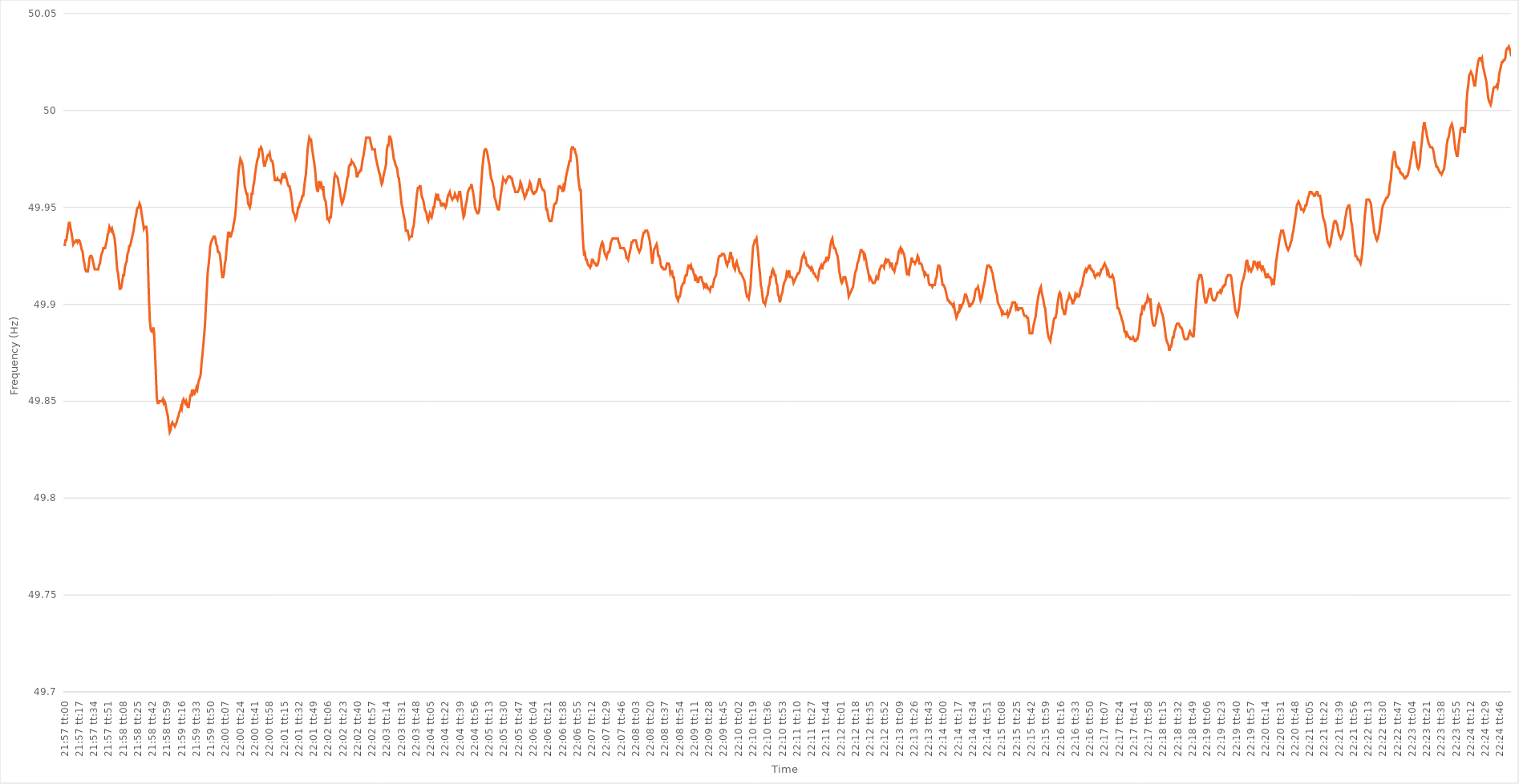
| Category | Series 0 |
|---|---|
| 0.9145833333333333 | 49.93 |
| 0.9145949074074075 | 49.933 |
| 0.9146064814814815 | 49.933 |
| 0.9146180555555555 | 49.936 |
| 0.9146296296296296 | 49.939 |
| 0.9146412037037037 | 49.942 |
| 0.9146527777777779 | 49.942 |
| 0.9146643518518518 | 49.939 |
| 0.914675925925926 | 49.937 |
| 0.9146875 | 49.934 |
| 0.9146990740740741 | 49.931 |
| 0.9147106481481481 | 49.932 |
| 0.9147222222222222 | 49.932 |
| 0.9147337962962964 | 49.933 |
| 0.9147453703703704 | 49.933 |
| 0.9147569444444444 | 49.932 |
| 0.9147685185185185 | 49.933 |
| 0.9147800925925926 | 49.933 |
| 0.9147916666666666 | 49.932 |
| 0.9148032407407407 | 49.93 |
| 0.9148148148148149 | 49.928 |
| 0.9148263888888889 | 49.927 |
| 0.9148379629629629 | 49.923 |
| 0.914849537037037 | 49.921 |
| 0.9148611111111111 | 49.918 |
| 0.9148726851851853 | 49.917 |
| 0.9148842592592592 | 49.917 |
| 0.9148958333333334 | 49.917 |
| 0.9149074074074074 | 49.92 |
| 0.9149189814814815 | 49.924 |
| 0.9149305555555555 | 49.925 |
| 0.9149421296296296 | 49.925 |
| 0.9149537037037038 | 49.924 |
| 0.9149652777777778 | 49.922 |
| 0.9149768518518518 | 49.92 |
| 0.9149884259259259 | 49.918 |
| 0.915 | 49.918 |
| 0.915011574074074 | 49.918 |
| 0.9150231481481481 | 49.918 |
| 0.9150347222222223 | 49.918 |
| 0.9150462962962963 | 49.92 |
| 0.9150578703703703 | 49.921 |
| 0.9150694444444444 | 49.924 |
| 0.9150810185185185 | 49.926 |
| 0.9150925925925927 | 49.927 |
| 0.9151041666666666 | 49.929 |
| 0.9151157407407408 | 49.929 |
| 0.9151273148148148 | 49.929 |
| 0.915138888888889 | 49.931 |
| 0.9151504629629629 | 49.933 |
| 0.915162037037037 | 49.936 |
| 0.9151736111111112 | 49.937 |
| 0.9151851851851852 | 49.94 |
| 0.9151967592592593 | 49.939 |
| 0.9152083333333333 | 49.938 |
| 0.9152199074074074 | 49.939 |
| 0.9152314814814814 | 49.937 |
| 0.9152430555555555 | 49.936 |
| 0.9152546296296297 | 49.934 |
| 0.9152662037037037 | 49.93 |
| 0.9152777777777777 | 49.924 |
| 0.9152893518518518 | 49.918 |
| 0.9153009259259259 | 49.916 |
| 0.9153125000000001 | 49.912 |
| 0.915324074074074 | 49.908 |
| 0.9153356481481482 | 49.908 |
| 0.9153472222222222 | 49.909 |
| 0.9153587962962964 | 49.912 |
| 0.9153703703703703 | 49.915 |
| 0.9153819444444444 | 49.915 |
| 0.9153935185185186 | 49.919 |
| 0.9154050925925926 | 49.921 |
| 0.9154166666666667 | 49.922 |
| 0.9154282407407407 | 49.926 |
| 0.9154398148148148 | 49.927 |
| 0.915451388888889 | 49.93 |
| 0.9154629629629629 | 49.93 |
| 0.9154745370370371 | 49.932 |
| 0.9154861111111111 | 49.934 |
| 0.9154976851851853 | 49.936 |
| 0.9155092592592592 | 49.938 |
| 0.9155208333333333 | 49.941 |
| 0.9155324074074075 | 49.944 |
| 0.9155439814814814 | 49.946 |
| 0.9155555555555556 | 49.949 |
| 0.9155671296296296 | 49.95 |
| 0.9155787037037038 | 49.95 |
| 0.9155902777777777 | 49.952 |
| 0.9156018518518518 | 49.951 |
| 0.915613425925926 | 49.948 |
| 0.915625 | 49.945 |
| 0.9156365740740741 | 49.942 |
| 0.9156481481481481 | 49.939 |
| 0.9156597222222222 | 49.94 |
| 0.9156712962962964 | 49.94 |
| 0.9156828703703703 | 49.94 |
| 0.9156944444444445 | 49.935 |
| 0.9157060185185185 | 49.917 |
| 0.9157175925925927 | 49.902 |
| 0.9157291666666666 | 49.891 |
| 0.9157407407407407 | 49.887 |
| 0.9157523148148149 | 49.886 |
| 0.9157638888888888 | 49.886 |
| 0.915775462962963 | 49.888 |
| 0.915787037037037 | 49.884 |
| 0.9157986111111112 | 49.874 |
| 0.9158101851851851 | 49.863 |
| 0.9158217592592592 | 49.852 |
| 0.9158333333333334 | 49.849 |
| 0.9158449074074074 | 49.849 |
| 0.9158564814814815 | 49.85 |
| 0.9158680555555555 | 49.85 |
| 0.9158796296296297 | 49.85 |
| 0.9158912037037038 | 49.85 |
| 0.9159027777777777 | 49.851 |
| 0.9159143518518519 | 49.849 |
| 0.9159259259259259 | 49.85 |
| 0.9159375000000001 | 49.849 |
| 0.915949074074074 | 49.846 |
| 0.9159606481481481 | 49.844 |
| 0.9159722222222223 | 49.842 |
| 0.9159837962962962 | 49.837 |
| 0.9159953703703704 | 49.834 |
| 0.9160069444444444 | 49.835 |
| 0.9160185185185186 | 49.838 |
| 0.9160300925925925 | 49.839 |
| 0.9160416666666666 | 49.838 |
| 0.9160532407407408 | 49.838 |
| 0.9160648148148148 | 49.837 |
| 0.9160763888888889 | 49.838 |
| 0.9160879629629629 | 49.839 |
| 0.9160995370370371 | 49.841 |
| 0.9161111111111112 | 49.842 |
| 0.9161226851851851 | 49.844 |
| 0.9161342592592593 | 49.845 |
| 0.9161458333333333 | 49.847 |
| 0.9161574074074075 | 49.846 |
| 0.9161689814814814 | 49.85 |
| 0.9161805555555556 | 49.851 |
| 0.9161921296296297 | 49.85 |
| 0.9162037037037036 | 49.849 |
| 0.9162152777777778 | 49.85 |
| 0.9162268518518518 | 49.848 |
| 0.916238425925926 | 49.847 |
| 0.9162499999999999 | 49.847 |
| 0.916261574074074 | 49.85 |
| 0.9162731481481482 | 49.853 |
| 0.9162847222222222 | 49.853 |
| 0.9162962962962963 | 49.856 |
| 0.9163078703703703 | 49.854 |
| 0.9163194444444445 | 49.855 |
| 0.9163310185185186 | 49.854 |
| 0.9163425925925925 | 49.855 |
| 0.9163541666666667 | 49.857 |
| 0.9163657407407407 | 49.856 |
| 0.9163773148148149 | 49.859 |
| 0.9163888888888888 | 49.861 |
| 0.916400462962963 | 49.862 |
| 0.9164120370370371 | 49.864 |
| 0.916423611111111 | 49.87 |
| 0.9164351851851852 | 49.874 |
| 0.9164467592592592 | 49.879 |
| 0.9164583333333334 | 49.884 |
| 0.9164699074074073 | 49.89 |
| 0.9164814814814815 | 49.899 |
| 0.9164930555555556 | 49.907 |
| 0.9165046296296296 | 49.916 |
| 0.9165162037037037 | 49.92 |
| 0.9165277777777777 | 49.924 |
| 0.9165393518518519 | 49.93 |
| 0.916550925925926 | 49.932 |
| 0.9165625 | 49.933 |
| 0.9165740740740741 | 49.934 |
| 0.9165856481481481 | 49.935 |
| 0.9165972222222223 | 49.935 |
| 0.9166087962962962 | 49.934 |
| 0.9166203703703704 | 49.931 |
| 0.9166319444444445 | 49.93 |
| 0.9166435185185186 | 49.927 |
| 0.9166550925925926 | 49.927 |
| 0.9166666666666666 | 49.926 |
| 0.9166782407407408 | 49.923 |
| 0.9166898148148147 | 49.918 |
| 0.9167013888888889 | 49.914 |
| 0.916712962962963 | 49.914 |
| 0.916724537037037 | 49.916 |
| 0.9167361111111111 | 49.921 |
| 0.9167476851851851 | 49.923 |
| 0.9167592592592593 | 49.929 |
| 0.9167708333333334 | 49.933 |
| 0.9167824074074074 | 49.937 |
| 0.9167939814814815 | 49.937 |
| 0.9168055555555555 | 49.935 |
| 0.9168171296296297 | 49.935 |
| 0.9168287037037036 | 49.937 |
| 0.9168402777777778 | 49.938 |
| 0.9168518518518519 | 49.941 |
| 0.916863425925926 | 49.943 |
| 0.916875 | 49.946 |
| 0.916886574074074 | 49.951 |
| 0.9168981481481482 | 49.958 |
| 0.9169097222222221 | 49.963 |
| 0.9169212962962963 | 49.969 |
| 0.9169328703703704 | 49.972 |
| 0.9169444444444445 | 49.975 |
| 0.9169560185185185 | 49.974 |
| 0.9169675925925925 | 49.973 |
| 0.9169791666666667 | 49.97 |
| 0.9169907407407408 | 49.966 |
| 0.9170023148148148 | 49.961 |
| 0.9170138888888889 | 49.959 |
| 0.917025462962963 | 49.957 |
| 0.9170370370370371 | 49.957 |
| 0.917048611111111 | 49.952 |
| 0.9170601851851852 | 49.951 |
| 0.9170717592592593 | 49.95 |
| 0.9170833333333334 | 49.952 |
| 0.9170949074074074 | 49.957 |
| 0.9171064814814814 | 49.957 |
| 0.9171180555555556 | 49.961 |
| 0.9171296296296297 | 49.963 |
| 0.9171412037037037 | 49.967 |
| 0.9171527777777778 | 49.97 |
| 0.9171643518518519 | 49.973 |
| 0.9171759259259259 | 49.975 |
| 0.9171874999999999 | 49.976 |
| 0.9171990740740741 | 49.98 |
| 0.9172106481481482 | 49.98 |
| 0.9172222222222222 | 49.981 |
| 0.9172337962962963 | 49.98 |
| 0.9172453703703703 | 49.977 |
| 0.9172569444444445 | 49.973 |
| 0.9172685185185184 | 49.971 |
| 0.9172800925925926 | 49.973 |
| 0.9172916666666667 | 49.974 |
| 0.9173032407407408 | 49.976 |
| 0.9173148148148148 | 49.977 |
| 0.9173263888888888 | 49.977 |
| 0.917337962962963 | 49.978 |
| 0.9173495370370371 | 49.975 |
| 0.9173611111111111 | 49.974 |
| 0.9173726851851852 | 49.974 |
| 0.9173842592592593 | 49.972 |
| 0.9173958333333333 | 49.968 |
| 0.9174074074074073 | 49.964 |
| 0.9174189814814815 | 49.964 |
| 0.9174305555555556 | 49.964 |
| 0.9174421296296296 | 49.965 |
| 0.9174537037037037 | 49.964 |
| 0.9174652777777778 | 49.964 |
| 0.9174768518518519 | 49.964 |
| 0.9174884259259258 | 49.963 |
| 0.9175 | 49.965 |
| 0.9175115740740741 | 49.967 |
| 0.9175231481481482 | 49.967 |
| 0.9175347222222222 | 49.965 |
| 0.9175462962962962 | 49.967 |
| 0.9175578703703704 | 49.966 |
| 0.9175694444444445 | 49.964 |
| 0.9175810185185185 | 49.962 |
| 0.9175925925925926 | 49.961 |
| 0.9176041666666667 | 49.961 |
| 0.9176157407407407 | 49.959 |
| 0.9176273148148147 | 49.956 |
| 0.9176388888888889 | 49.953 |
| 0.917650462962963 | 49.948 |
| 0.917662037037037 | 49.947 |
| 0.9176736111111111 | 49.946 |
| 0.9176851851851852 | 49.944 |
| 0.9176967592592593 | 49.945 |
| 0.9177083333333332 | 49.947 |
| 0.9177199074074074 | 49.95 |
| 0.9177314814814815 | 49.95 |
| 0.9177430555555556 | 49.952 |
| 0.9177546296296296 | 49.953 |
| 0.9177662037037037 | 49.954 |
| 0.9177777777777778 | 49.956 |
| 0.917789351851852 | 49.956 |
| 0.9178009259259259 | 49.96 |
| 0.9178125 | 49.964 |
| 0.9178240740740741 | 49.967 |
| 0.9178356481481482 | 49.973 |
| 0.9178472222222221 | 49.98 |
| 0.9178587962962963 | 49.983 |
| 0.9178703703703704 | 49.986 |
| 0.9178819444444444 | 49.985 |
| 0.9178935185185185 | 49.985 |
| 0.9179050925925926 | 49.981 |
| 0.9179166666666667 | 49.978 |
| 0.9179282407407406 | 49.975 |
| 0.9179398148148148 | 49.972 |
| 0.9179513888888889 | 49.968 |
| 0.917962962962963 | 49.962 |
| 0.917974537037037 | 49.959 |
| 0.9179861111111111 | 49.958 |
| 0.9179976851851852 | 49.963 |
| 0.9180092592592594 | 49.963 |
| 0.9180208333333333 | 49.961 |
| 0.9180324074074074 | 49.962 |
| 0.9180439814814815 | 49.96 |
| 0.9180555555555556 | 49.961 |
| 0.9180671296296296 | 49.956 |
| 0.9180787037037037 | 49.954 |
| 0.9180902777777779 | 49.953 |
| 0.9181018518518518 | 49.949 |
| 0.9181134259259259 | 49.944 |
| 0.918125 | 49.944 |
| 0.9181365740740741 | 49.943 |
| 0.918148148148148 | 49.945 |
| 0.9181597222222222 | 49.945 |
| 0.9181712962962963 | 49.95 |
| 0.9181828703703704 | 49.955 |
| 0.9181944444444444 | 49.959 |
| 0.9182060185185185 | 49.965 |
| 0.9182175925925926 | 49.967 |
| 0.9182291666666668 | 49.966 |
| 0.9182407407407407 | 49.966 |
| 0.9182523148148148 | 49.965 |
| 0.9182638888888889 | 49.962 |
| 0.918275462962963 | 49.96 |
| 0.918287037037037 | 49.957 |
| 0.9182986111111111 | 49.954 |
| 0.9183101851851853 | 49.952 |
| 0.9183217592592593 | 49.953 |
| 0.9183333333333333 | 49.955 |
| 0.9183449074074074 | 49.957 |
| 0.9183564814814815 | 49.959 |
| 0.9183680555555555 | 49.962 |
| 0.9183796296296296 | 49.965 |
| 0.9183912037037038 | 49.966 |
| 0.9184027777777778 | 49.971 |
| 0.9184143518518518 | 49.972 |
| 0.9184259259259259 | 49.972 |
| 0.9184375 | 49.974 |
| 0.9184490740740742 | 49.973 |
| 0.9184606481481481 | 49.973 |
| 0.9184722222222222 | 49.972 |
| 0.9184837962962963 | 49.971 |
| 0.9184953703703704 | 49.97 |
| 0.9185069444444444 | 49.966 |
| 0.9185185185185185 | 49.966 |
| 0.9185300925925927 | 49.968 |
| 0.9185416666666667 | 49.968 |
| 0.9185532407407407 | 49.969 |
| 0.9185648148148148 | 49.969 |
| 0.9185763888888889 | 49.972 |
| 0.9185879629629629 | 49.975 |
| 0.918599537037037 | 49.977 |
| 0.9186111111111112 | 49.98 |
| 0.9186226851851852 | 49.983 |
| 0.9186342592592592 | 49.986 |
| 0.9186458333333333 | 49.986 |
| 0.9186574074074074 | 49.986 |
| 0.9186689814814816 | 49.986 |
| 0.9186805555555555 | 49.986 |
| 0.9186921296296297 | 49.984 |
| 0.9187037037037037 | 49.982 |
| 0.9187152777777778 | 49.98 |
| 0.9187268518518518 | 49.98 |
| 0.9187384259259259 | 49.98 |
| 0.9187500000000001 | 49.98 |
| 0.9187615740740741 | 49.976 |
| 0.9187731481481481 | 49.974 |
| 0.9187847222222222 | 49.972 |
| 0.9187962962962963 | 49.97 |
| 0.9188078703703703 | 49.968 |
| 0.9188194444444444 | 49.967 |
| 0.9188310185185186 | 49.964 |
| 0.9188425925925926 | 49.962 |
| 0.9188541666666666 | 49.963 |
| 0.9188657407407407 | 49.966 |
| 0.9188773148148148 | 49.968 |
| 0.918888888888889 | 49.97 |
| 0.9189004629629629 | 49.972 |
| 0.918912037037037 | 49.98 |
| 0.9189236111111111 | 49.982 |
| 0.9189351851851852 | 49.982 |
| 0.9189467592592592 | 49.987 |
| 0.9189583333333333 | 49.986 |
| 0.9189699074074075 | 49.985 |
| 0.9189814814814815 | 49.981 |
| 0.9189930555555555 | 49.979 |
| 0.9190046296296296 | 49.975 |
| 0.9190162037037037 | 49.974 |
| 0.9190277777777779 | 49.972 |
| 0.9190393518518518 | 49.971 |
| 0.919050925925926 | 49.97 |
| 0.9190625 | 49.966 |
| 0.919074074074074 | 49.965 |
| 0.9190856481481481 | 49.961 |
| 0.9190972222222222 | 49.957 |
| 0.9191087962962964 | 49.952 |
| 0.9191203703703703 | 49.95 |
| 0.9191319444444445 | 49.947 |
| 0.9191435185185185 | 49.945 |
| 0.9191550925925926 | 49.943 |
| 0.9191666666666666 | 49.938 |
| 0.9191782407407407 | 49.938 |
| 0.9191898148148149 | 49.938 |
| 0.9192013888888889 | 49.936 |
| 0.919212962962963 | 49.934 |
| 0.919224537037037 | 49.935 |
| 0.9192361111111111 | 49.935 |
| 0.9192476851851853 | 49.935 |
| 0.9192592592592592 | 49.939 |
| 0.9192708333333334 | 49.94 |
| 0.9192824074074074 | 49.944 |
| 0.9192939814814814 | 49.948 |
| 0.9193055555555555 | 49.953 |
| 0.9193171296296296 | 49.957 |
| 0.9193287037037038 | 49.96 |
| 0.9193402777777777 | 49.96 |
| 0.9193518518518519 | 49.961 |
| 0.9193634259259259 | 49.961 |
| 0.919375 | 49.957 |
| 0.919386574074074 | 49.955 |
| 0.9193981481481481 | 49.954 |
| 0.9194097222222223 | 49.952 |
| 0.9194212962962963 | 49.949 |
| 0.9194328703703704 | 49.948 |
| 0.9194444444444444 | 49.947 |
| 0.9194560185185185 | 49.944 |
| 0.9194675925925927 | 49.943 |
| 0.9194791666666666 | 49.945 |
| 0.9194907407407408 | 49.947 |
| 0.9195023148148148 | 49.946 |
| 0.9195138888888889 | 49.945 |
| 0.9195254629629629 | 49.947 |
| 0.919537037037037 | 49.95 |
| 0.9195486111111112 | 49.95 |
| 0.9195601851851851 | 49.954 |
| 0.9195717592592593 | 49.956 |
| 0.9195833333333333 | 49.955 |
| 0.9195949074074075 | 49.957 |
| 0.9196064814814814 | 49.954 |
| 0.9196180555555555 | 49.954 |
| 0.9196296296296297 | 49.953 |
| 0.9196412037037037 | 49.951 |
| 0.9196527777777778 | 49.951 |
| 0.9196643518518518 | 49.952 |
| 0.919675925925926 | 49.952 |
| 0.9196875000000001 | 49.951 |
| 0.919699074074074 | 49.95 |
| 0.9197106481481482 | 49.951 |
| 0.9197222222222222 | 49.954 |
| 0.9197337962962964 | 49.956 |
| 0.9197453703703703 | 49.957 |
| 0.9197569444444444 | 49.958 |
| 0.9197685185185186 | 49.956 |
| 0.9197800925925925 | 49.955 |
| 0.9197916666666667 | 49.954 |
| 0.9198032407407407 | 49.955 |
| 0.9198148148148149 | 49.955 |
| 0.9198263888888888 | 49.957 |
| 0.9198379629629629 | 49.956 |
| 0.9198495370370371 | 49.955 |
| 0.9198611111111111 | 49.954 |
| 0.9198726851851852 | 49.956 |
| 0.9198842592592592 | 49.958 |
| 0.9198958333333334 | 49.958 |
| 0.9199074074074075 | 49.955 |
| 0.9199189814814814 | 49.951 |
| 0.9199305555555556 | 49.948 |
| 0.9199421296296296 | 49.945 |
| 0.9199537037037038 | 49.946 |
| 0.9199652777777777 | 49.95 |
| 0.9199768518518519 | 49.952 |
| 0.919988425925926 | 49.954 |
| 0.9199999999999999 | 49.958 |
| 0.9200115740740741 | 49.959 |
| 0.9200231481481481 | 49.96 |
| 0.9200347222222223 | 49.96 |
| 0.9200462962962962 | 49.962 |
| 0.9200578703703703 | 49.96 |
| 0.9200694444444445 | 49.958 |
| 0.9200810185185185 | 49.955 |
| 0.9200925925925926 | 49.951 |
| 0.9201041666666666 | 49.949 |
| 0.9201157407407408 | 49.948 |
| 0.9201273148148149 | 49.947 |
| 0.9201388888888888 | 49.947 |
| 0.920150462962963 | 49.948 |
| 0.920162037037037 | 49.952 |
| 0.9201736111111112 | 49.959 |
| 0.9201851851851851 | 49.965 |
| 0.9201967592592593 | 49.971 |
| 0.9202083333333334 | 49.975 |
| 0.9202199074074073 | 49.979 |
| 0.9202314814814815 | 49.98 |
| 0.9202430555555555 | 49.98 |
| 0.9202546296296297 | 49.979 |
| 0.9202662037037036 | 49.977 |
| 0.9202777777777778 | 49.974 |
| 0.9202893518518519 | 49.972 |
| 0.9203009259259259 | 49.968 |
| 0.9203125 | 49.965 |
| 0.920324074074074 | 49.964 |
| 0.9203356481481482 | 49.962 |
| 0.9203472222222223 | 49.96 |
| 0.9203587962962962 | 49.955 |
| 0.9203703703703704 | 49.954 |
| 0.9203819444444444 | 49.952 |
| 0.9203935185185186 | 49.95 |
| 0.9204050925925925 | 49.949 |
| 0.9204166666666667 | 49.949 |
| 0.9204282407407408 | 49.952 |
| 0.9204398148148148 | 49.956 |
| 0.9204513888888889 | 49.959 |
| 0.9204629629629629 | 49.962 |
| 0.9204745370370371 | 49.965 |
| 0.920486111111111 | 49.964 |
| 0.9204976851851852 | 49.964 |
| 0.9205092592592593 | 49.963 |
| 0.9205208333333333 | 49.964 |
| 0.9205324074074074 | 49.965 |
| 0.9205439814814814 | 49.966 |
| 0.9205555555555556 | 49.966 |
| 0.9205671296296297 | 49.966 |
| 0.9205787037037036 | 49.965 |
| 0.9205902777777778 | 49.965 |
| 0.9206018518518518 | 49.963 |
| 0.920613425925926 | 49.961 |
| 0.9206249999999999 | 49.96 |
| 0.9206365740740741 | 49.958 |
| 0.9206481481481482 | 49.958 |
| 0.9206597222222223 | 49.958 |
| 0.9206712962962963 | 49.958 |
| 0.9206828703703703 | 49.959 |
| 0.9206944444444445 | 49.96 |
| 0.9207060185185184 | 49.963 |
| 0.9207175925925926 | 49.962 |
| 0.9207291666666667 | 49.96 |
| 0.9207407407407407 | 49.958 |
| 0.9207523148148148 | 49.957 |
| 0.9207638888888888 | 49.955 |
| 0.920775462962963 | 49.956 |
| 0.9207870370370371 | 49.957 |
| 0.920798611111111 | 49.959 |
| 0.9208101851851852 | 49.959 |
| 0.9208217592592592 | 49.961 |
| 0.9208333333333334 | 49.963 |
| 0.9208449074074073 | 49.962 |
| 0.9208564814814815 | 49.959 |
| 0.9208680555555556 | 49.958 |
| 0.9208796296296297 | 49.957 |
| 0.9208912037037037 | 49.957 |
| 0.9209027777777777 | 49.958 |
| 0.9209143518518519 | 49.958 |
| 0.920925925925926 | 49.959 |
| 0.9209375 | 49.961 |
| 0.9209490740740741 | 49.963 |
| 0.9209606481481482 | 49.965 |
| 0.9209722222222222 | 49.963 |
| 0.9209837962962962 | 49.961 |
| 0.9209953703703704 | 49.96 |
| 0.9210069444444445 | 49.959 |
| 0.9210185185185185 | 49.959 |
| 0.9210300925925926 | 49.958 |
| 0.9210416666666666 | 49.954 |
| 0.9210532407407408 | 49.949 |
| 0.9210648148148147 | 49.949 |
| 0.9210763888888889 | 49.946 |
| 0.921087962962963 | 49.944 |
| 0.9210995370370371 | 49.943 |
| 0.9211111111111111 | 49.943 |
| 0.9211226851851851 | 49.943 |
| 0.9211342592592593 | 49.945 |
| 0.9211458333333334 | 49.948 |
| 0.9211574074074074 | 49.951 |
| 0.9211689814814815 | 49.952 |
| 0.9211805555555556 | 49.952 |
| 0.9211921296296296 | 49.953 |
| 0.9212037037037036 | 49.956 |
| 0.9212152777777778 | 49.96 |
| 0.9212268518518519 | 49.961 |
| 0.9212384259259259 | 49.961 |
| 0.92125 | 49.96 |
| 0.921261574074074 | 49.96 |
| 0.9212731481481482 | 49.958 |
| 0.9212847222222221 | 49.961 |
| 0.9212962962962963 | 49.96 |
| 0.9213078703703704 | 49.963 |
| 0.9213194444444445 | 49.966 |
| 0.9213310185185185 | 49.968 |
| 0.9213425925925925 | 49.97 |
| 0.9213541666666667 | 49.972 |
| 0.9213657407407408 | 49.974 |
| 0.9213773148148148 | 49.974 |
| 0.9213888888888889 | 49.98 |
| 0.921400462962963 | 49.981 |
| 0.921412037037037 | 49.981 |
| 0.921423611111111 | 49.98 |
| 0.9214351851851852 | 49.98 |
| 0.9214467592592593 | 49.978 |
| 0.9214583333333333 | 49.977 |
| 0.9214699074074074 | 49.973 |
| 0.9214814814814815 | 49.966 |
| 0.9214930555555556 | 49.962 |
| 0.9215046296296295 | 49.959 |
| 0.9215162037037037 | 49.959 |
| 0.9215277777777778 | 49.948 |
| 0.9215393518518519 | 49.938 |
| 0.9215509259259259 | 49.93 |
| 0.9215625 | 49.925 |
| 0.9215740740740741 | 49.926 |
| 0.9215856481481483 | 49.923 |
| 0.9215972222222222 | 49.923 |
| 0.9216087962962963 | 49.921 |
| 0.9216203703703704 | 49.92 |
| 0.9216319444444445 | 49.92 |
| 0.9216435185185184 | 49.919 |
| 0.9216550925925926 | 49.92 |
| 0.9216666666666667 | 49.923 |
| 0.9216782407407407 | 49.923 |
| 0.9216898148148148 | 49.922 |
| 0.9217013888888889 | 49.921 |
| 0.921712962962963 | 49.921 |
| 0.9217245370370369 | 49.92 |
| 0.9217361111111111 | 49.92 |
| 0.9217476851851852 | 49.921 |
| 0.9217592592592593 | 49.923 |
| 0.9217708333333333 | 49.927 |
| 0.9217824074074074 | 49.929 |
| 0.9217939814814815 | 49.931 |
| 0.9218055555555557 | 49.932 |
| 0.9218171296296296 | 49.931 |
| 0.9218287037037037 | 49.928 |
| 0.9218402777777778 | 49.926 |
| 0.9218518518518519 | 49.925 |
| 0.9218634259259259 | 49.924 |
| 0.921875 | 49.926 |
| 0.9218865740740741 | 49.927 |
| 0.9218981481481481 | 49.927 |
| 0.9219097222222222 | 49.929 |
| 0.9219212962962963 | 49.932 |
| 0.9219328703703704 | 49.933 |
| 0.9219444444444443 | 49.934 |
| 0.9219560185185185 | 49.934 |
| 0.9219675925925926 | 49.934 |
| 0.9219791666666667 | 49.934 |
| 0.9219907407407407 | 49.934 |
| 0.9220023148148148 | 49.934 |
| 0.9220138888888889 | 49.934 |
| 0.9220254629629631 | 49.932 |
| 0.922037037037037 | 49.931 |
| 0.9220486111111111 | 49.929 |
| 0.9220601851851852 | 49.929 |
| 0.9220717592592593 | 49.929 |
| 0.9220833333333333 | 49.929 |
| 0.9220949074074074 | 49.929 |
| 0.9221064814814816 | 49.928 |
| 0.9221180555555555 | 49.927 |
| 0.9221296296296296 | 49.924 |
| 0.9221412037037037 | 49.924 |
| 0.9221527777777778 | 49.923 |
| 0.9221643518518517 | 49.925 |
| 0.9221759259259259 | 49.927 |
| 0.9221875 | 49.929 |
| 0.9221990740740741 | 49.932 |
| 0.9222106481481481 | 49.932 |
| 0.9222222222222222 | 49.933 |
| 0.9222337962962963 | 49.933 |
| 0.9222453703703705 | 49.933 |
| 0.9222569444444444 | 49.933 |
| 0.9222685185185185 | 49.931 |
| 0.9222800925925926 | 49.929 |
| 0.9222916666666667 | 49.928 |
| 0.9223032407407407 | 49.927 |
| 0.9223148148148148 | 49.928 |
| 0.922326388888889 | 49.929 |
| 0.922337962962963 | 49.933 |
| 0.922349537037037 | 49.935 |
| 0.9223611111111111 | 49.937 |
| 0.9223726851851852 | 49.937 |
| 0.9223842592592592 | 49.938 |
| 0.9223958333333333 | 49.938 |
| 0.9224074074074075 | 49.938 |
| 0.9224189814814815 | 49.937 |
| 0.9224305555555555 | 49.935 |
| 0.9224421296296296 | 49.933 |
| 0.9224537037037037 | 49.93 |
| 0.9224652777777779 | 49.925 |
| 0.9224768518518518 | 49.921 |
| 0.922488425925926 | 49.925 |
| 0.9225 | 49.928 |
| 0.9225115740740741 | 49.929 |
| 0.9225231481481481 | 49.93 |
| 0.9225347222222222 | 49.931 |
| 0.9225462962962964 | 49.929 |
| 0.9225578703703704 | 49.925 |
| 0.9225694444444444 | 49.925 |
| 0.9225810185185185 | 49.923 |
| 0.9225925925925926 | 49.92 |
| 0.9226041666666666 | 49.919 |
| 0.9226157407407407 | 49.919 |
| 0.9226273148148149 | 49.918 |
| 0.9226388888888889 | 49.918 |
| 0.9226504629629629 | 49.918 |
| 0.922662037037037 | 49.919 |
| 0.9226736111111111 | 49.921 |
| 0.9226851851851853 | 49.921 |
| 0.9226967592592592 | 49.921 |
| 0.9227083333333334 | 49.92 |
| 0.9227199074074074 | 49.916 |
| 0.9227314814814815 | 49.917 |
| 0.9227430555555555 | 49.917 |
| 0.9227546296296296 | 49.914 |
| 0.9227662037037038 | 49.914 |
| 0.9227777777777778 | 49.911 |
| 0.9227893518518518 | 49.907 |
| 0.9228009259259259 | 49.904 |
| 0.9228125 | 49.903 |
| 0.922824074074074 | 49.902 |
| 0.9228356481481481 | 49.904 |
| 0.9228472222222223 | 49.904 |
| 0.9228587962962963 | 49.906 |
| 0.9228703703703703 | 49.909 |
| 0.9228819444444444 | 49.91 |
| 0.9228935185185185 | 49.911 |
| 0.9229050925925927 | 49.911 |
| 0.9229166666666666 | 49.914 |
| 0.9229282407407408 | 49.915 |
| 0.9229398148148148 | 49.915 |
| 0.922951388888889 | 49.918 |
| 0.9229629629629629 | 49.92 |
| 0.922974537037037 | 49.92 |
| 0.9229861111111112 | 49.919 |
| 0.9229976851851852 | 49.92 |
| 0.9230092592592593 | 49.918 |
| 0.9230208333333333 | 49.918 |
| 0.9230324074074074 | 49.916 |
| 0.9230439814814816 | 49.915 |
| 0.9230555555555555 | 49.912 |
| 0.9230671296296297 | 49.914 |
| 0.9230787037037037 | 49.913 |
| 0.9230902777777777 | 49.911 |
| 0.9231018518518518 | 49.913 |
| 0.9231134259259259 | 49.914 |
| 0.9231250000000001 | 49.914 |
| 0.923136574074074 | 49.914 |
| 0.9231481481481482 | 49.912 |
| 0.9231597222222222 | 49.911 |
| 0.9231712962962964 | 49.909 |
| 0.9231828703703703 | 49.91 |
| 0.9231944444444444 | 49.909 |
| 0.9232060185185186 | 49.91 |
| 0.9232175925925926 | 49.909 |
| 0.9232291666666667 | 49.908 |
| 0.9232407407407407 | 49.908 |
| 0.9232523148148148 | 49.907 |
| 0.923263888888889 | 49.909 |
| 0.9232754629629629 | 49.909 |
| 0.9232870370370371 | 49.909 |
| 0.9232986111111111 | 49.911 |
| 0.9233101851851852 | 49.913 |
| 0.9233217592592592 | 49.914 |
| 0.9233333333333333 | 49.915 |
| 0.9233449074074075 | 49.918 |
| 0.9233564814814814 | 49.921 |
| 0.9233680555555556 | 49.924 |
| 0.9233796296296296 | 49.925 |
| 0.9233912037037038 | 49.925 |
| 0.9234027777777777 | 49.925 |
| 0.9234143518518518 | 49.926 |
| 0.923425925925926 | 49.926 |
| 0.9234375 | 49.926 |
| 0.9234490740740741 | 49.925 |
| 0.9234606481481481 | 49.923 |
| 0.9234722222222222 | 49.921 |
| 0.9234837962962964 | 49.92 |
| 0.9234953703703703 | 49.922 |
| 0.9235069444444445 | 49.922 |
| 0.9235185185185185 | 49.925 |
| 0.9235300925925927 | 49.927 |
| 0.9235416666666666 | 49.924 |
| 0.9235532407407407 | 49.924 |
| 0.9235648148148149 | 49.92 |
| 0.9235763888888888 | 49.919 |
| 0.923587962962963 | 49.918 |
| 0.923599537037037 | 49.921 |
| 0.9236111111111112 | 49.922 |
| 0.9236226851851851 | 49.92 |
| 0.9236342592592592 | 49.919 |
| 0.9236458333333334 | 49.917 |
| 0.9236574074074074 | 49.916 |
| 0.9236689814814815 | 49.916 |
| 0.9236805555555555 | 49.915 |
| 0.9236921296296297 | 49.914 |
| 0.9237037037037038 | 49.913 |
| 0.9237152777777777 | 49.912 |
| 0.9237268518518519 | 49.909 |
| 0.9237384259259259 | 49.906 |
| 0.9237500000000001 | 49.904 |
| 0.923761574074074 | 49.904 |
| 0.9237731481481481 | 49.903 |
| 0.9237847222222223 | 49.906 |
| 0.9237962962962962 | 49.909 |
| 0.9238078703703704 | 49.917 |
| 0.9238194444444444 | 49.923 |
| 0.9238310185185186 | 49.93 |
| 0.9238425925925925 | 49.931 |
| 0.9238541666666666 | 49.933 |
| 0.9238657407407408 | 49.933 |
| 0.9238773148148148 | 49.934 |
| 0.9238888888888889 | 49.93 |
| 0.9239004629629629 | 49.926 |
| 0.9239120370370371 | 49.92 |
| 0.9239236111111112 | 49.916 |
| 0.9239351851851851 | 49.91 |
| 0.9239467592592593 | 49.908 |
| 0.9239583333333333 | 49.904 |
| 0.9239699074074075 | 49.901 |
| 0.9239814814814814 | 49.901 |
| 0.9239930555555556 | 49.9 |
| 0.9240046296296297 | 49.902 |
| 0.9240162037037036 | 49.904 |
| 0.9240277777777778 | 49.905 |
| 0.9240393518518518 | 49.909 |
| 0.924050925925926 | 49.91 |
| 0.9240624999999999 | 49.914 |
| 0.924074074074074 | 49.914 |
| 0.9240856481481482 | 49.917 |
| 0.9240972222222222 | 49.918 |
| 0.9241087962962963 | 49.917 |
| 0.9241203703703703 | 49.915 |
| 0.9241319444444445 | 49.915 |
| 0.9241435185185186 | 49.911 |
| 0.9241550925925925 | 49.91 |
| 0.9241666666666667 | 49.905 |
| 0.9241782407407407 | 49.904 |
| 0.9241898148148149 | 49.901 |
| 0.9242013888888888 | 49.903 |
| 0.924212962962963 | 49.905 |
| 0.9242245370370371 | 49.906 |
| 0.9242361111111111 | 49.909 |
| 0.9242476851851852 | 49.911 |
| 0.9242592592592592 | 49.912 |
| 0.9242708333333334 | 49.913 |
| 0.9242824074074073 | 49.916 |
| 0.9242939814814815 | 49.915 |
| 0.9243055555555556 | 49.917 |
| 0.9243171296296296 | 49.917 |
| 0.9243287037037037 | 49.914 |
| 0.9243402777777777 | 49.914 |
| 0.9243518518518519 | 49.914 |
| 0.924363425925926 | 49.913 |
| 0.924375 | 49.911 |
| 0.9243865740740741 | 49.912 |
| 0.9243981481481481 | 49.913 |
| 0.9244097222222223 | 49.914 |
| 0.9244212962962962 | 49.915 |
| 0.9244328703703704 | 49.916 |
| 0.9244444444444445 | 49.916 |
| 0.9244560185185186 | 49.917 |
| 0.9244675925925926 | 49.919 |
| 0.9244791666666666 | 49.922 |
| 0.9244907407407408 | 49.924 |
| 0.9245023148148147 | 49.925 |
| 0.9245138888888889 | 49.926 |
| 0.924525462962963 | 49.924 |
| 0.924537037037037 | 49.924 |
| 0.9245486111111111 | 49.921 |
| 0.9245601851851851 | 49.92 |
| 0.9245717592592593 | 49.92 |
| 0.9245833333333334 | 49.919 |
| 0.9245949074074074 | 49.919 |
| 0.9246064814814815 | 49.918 |
| 0.9246180555555555 | 49.919 |
| 0.9246296296296297 | 49.918 |
| 0.9246412037037036 | 49.916 |
| 0.9246527777777778 | 49.916 |
| 0.9246643518518519 | 49.915 |
| 0.924675925925926 | 49.914 |
| 0.9246875 | 49.914 |
| 0.924699074074074 | 49.913 |
| 0.9247106481481482 | 49.915 |
| 0.9247222222222221 | 49.918 |
| 0.9247337962962963 | 49.919 |
| 0.9247453703703704 | 49.92 |
| 0.9247569444444445 | 49.918 |
| 0.9247685185185185 | 49.92 |
| 0.9247800925925925 | 49.921 |
| 0.9247916666666667 | 49.922 |
| 0.9248032407407408 | 49.922 |
| 0.9248148148148148 | 49.924 |
| 0.9248263888888889 | 49.924 |
| 0.924837962962963 | 49.923 |
| 0.9248495370370371 | 49.924 |
| 0.924861111111111 | 49.928 |
| 0.9248726851851852 | 49.931 |
| 0.9248842592592593 | 49.933 |
| 0.9248958333333334 | 49.934 |
| 0.9249074074074074 | 49.931 |
| 0.9249189814814814 | 49.929 |
| 0.9249305555555556 | 49.929 |
| 0.9249421296296297 | 49.928 |
| 0.9249537037037037 | 49.926 |
| 0.9249652777777778 | 49.925 |
| 0.9249768518518519 | 49.922 |
| 0.9249884259259259 | 49.917 |
| 0.9249999999999999 | 49.915 |
| 0.9250115740740741 | 49.912 |
| 0.9250231481481482 | 49.911 |
| 0.9250347222222222 | 49.912 |
| 0.9250462962962963 | 49.914 |
| 0.9250578703703703 | 49.914 |
| 0.9250694444444445 | 49.914 |
| 0.9250810185185184 | 49.912 |
| 0.9250925925925926 | 49.91 |
| 0.9251041666666667 | 49.908 |
| 0.9251157407407408 | 49.904 |
| 0.9251273148148148 | 49.905 |
| 0.9251388888888888 | 49.906 |
| 0.925150462962963 | 49.907 |
| 0.9251620370370371 | 49.908 |
| 0.9251736111111111 | 49.909 |
| 0.9251851851851852 | 49.912 |
| 0.9251967592592593 | 49.915 |
| 0.9252083333333333 | 49.917 |
| 0.9252199074074073 | 49.918 |
| 0.9252314814814815 | 49.921 |
| 0.9252430555555556 | 49.922 |
| 0.9252546296296296 | 49.924 |
| 0.9252662037037037 | 49.926 |
| 0.9252777777777778 | 49.928 |
| 0.9252893518518519 | 49.928 |
| 0.9253009259259258 | 49.927 |
| 0.9253125 | 49.927 |
| 0.9253240740740741 | 49.924 |
| 0.9253356481481482 | 49.925 |
| 0.9253472222222222 | 49.923 |
| 0.9253587962962962 | 49.92 |
| 0.9253703703703704 | 49.918 |
| 0.9253819444444445 | 49.916 |
| 0.9253935185185185 | 49.913 |
| 0.9254050925925926 | 49.914 |
| 0.9254166666666667 | 49.913 |
| 0.9254282407407407 | 49.912 |
| 0.9254398148148147 | 49.911 |
| 0.9254513888888889 | 49.911 |
| 0.925462962962963 | 49.911 |
| 0.925474537037037 | 49.912 |
| 0.9254861111111111 | 49.914 |
| 0.9254976851851852 | 49.913 |
| 0.9255092592592593 | 49.913 |
| 0.9255208333333332 | 49.916 |
| 0.9255324074074074 | 49.918 |
| 0.9255439814814815 | 49.919 |
| 0.9255555555555556 | 49.92 |
| 0.9255671296296296 | 49.92 |
| 0.9255787037037037 | 49.92 |
| 0.9255902777777778 | 49.919 |
| 0.925601851851852 | 49.922 |
| 0.9256134259259259 | 49.923 |
| 0.925625 | 49.922 |
| 0.9256365740740741 | 49.923 |
| 0.9256481481481482 | 49.923 |
| 0.9256597222222221 | 49.922 |
| 0.9256712962962963 | 49.92 |
| 0.9256828703703704 | 49.921 |
| 0.9256944444444444 | 49.921 |
| 0.9257060185185185 | 49.918 |
| 0.9257175925925926 | 49.918 |
| 0.9257291666666667 | 49.917 |
| 0.9257407407407406 | 49.919 |
| 0.9257523148148148 | 49.921 |
| 0.9257638888888889 | 49.921 |
| 0.925775462962963 | 49.924 |
| 0.925787037037037 | 49.927 |
| 0.9257986111111111 | 49.928 |
| 0.9258101851851852 | 49.929 |
| 0.9258217592592594 | 49.927 |
| 0.9258333333333333 | 49.928 |
| 0.9258449074074074 | 49.927 |
| 0.9258564814814815 | 49.926 |
| 0.9258680555555556 | 49.924 |
| 0.9258796296296296 | 49.921 |
| 0.9258912037037037 | 49.917 |
| 0.9259027777777779 | 49.915 |
| 0.9259143518518518 | 49.917 |
| 0.9259259259259259 | 49.916 |
| 0.9259375 | 49.919 |
| 0.9259490740740741 | 49.921 |
| 0.925960648148148 | 49.924 |
| 0.9259722222222222 | 49.922 |
| 0.9259837962962963 | 49.922 |
| 0.9259953703703704 | 49.922 |
| 0.9260069444444444 | 49.921 |
| 0.9260185185185185 | 49.922 |
| 0.9260300925925926 | 49.923 |
| 0.9260416666666668 | 49.925 |
| 0.9260532407407407 | 49.924 |
| 0.9260648148148148 | 49.921 |
| 0.9260763888888889 | 49.921 |
| 0.926087962962963 | 49.921 |
| 0.926099537037037 | 49.92 |
| 0.9261111111111111 | 49.918 |
| 0.9261226851851853 | 49.917 |
| 0.9261342592592593 | 49.915 |
| 0.9261458333333333 | 49.916 |
| 0.9261574074074074 | 49.915 |
| 0.9261689814814815 | 49.915 |
| 0.9261805555555555 | 49.915 |
| 0.9261921296296296 | 49.911 |
| 0.9262037037037038 | 49.91 |
| 0.9262152777777778 | 49.91 |
| 0.9262268518518518 | 49.91 |
| 0.9262384259259259 | 49.909 |
| 0.92625 | 49.91 |
| 0.9262615740740742 | 49.91 |
| 0.9262731481481481 | 49.91 |
| 0.9262847222222222 | 49.913 |
| 0.9262962962962963 | 49.914 |
| 0.9263078703703704 | 49.918 |
| 0.9263194444444444 | 49.92 |
| 0.9263310185185185 | 49.92 |
| 0.9263425925925927 | 49.919 |
| 0.9263541666666667 | 49.916 |
| 0.9263657407407407 | 49.913 |
| 0.9263773148148148 | 49.91 |
| 0.9263888888888889 | 49.91 |
| 0.9264004629629629 | 49.909 |
| 0.926412037037037 | 49.908 |
| 0.9264236111111112 | 49.906 |
| 0.9264351851851852 | 49.904 |
| 0.9264467592592592 | 49.902 |
| 0.9264583333333333 | 49.902 |
| 0.9264699074074074 | 49.901 |
| 0.9264814814814816 | 49.901 |
| 0.9264930555555555 | 49.9 |
| 0.9265046296296297 | 49.9 |
| 0.9265162037037037 | 49.899 |
| 0.9265277777777778 | 49.9 |
| 0.9265393518518518 | 49.897 |
| 0.9265509259259259 | 49.895 |
| 0.9265625000000001 | 49.893 |
| 0.9265740740740741 | 49.894 |
| 0.9265856481481481 | 49.896 |
| 0.9265972222222222 | 49.896 |
| 0.9266087962962963 | 49.9 |
| 0.9266203703703703 | 49.898 |
| 0.9266319444444444 | 49.899 |
| 0.9266435185185186 | 49.9 |
| 0.9266550925925926 | 49.901 |
| 0.9266666666666666 | 49.903 |
| 0.9266782407407407 | 49.905 |
| 0.9266898148148148 | 49.905 |
| 0.926701388888889 | 49.904 |
| 0.9267129629629629 | 49.902 |
| 0.926724537037037 | 49.901 |
| 0.9267361111111111 | 49.899 |
| 0.9267476851851852 | 49.899 |
| 0.9267592592592592 | 49.9 |
| 0.9267708333333333 | 49.9 |
| 0.9267824074074075 | 49.901 |
| 0.9267939814814815 | 49.902 |
| 0.9268055555555555 | 49.904 |
| 0.9268171296296296 | 49.907 |
| 0.9268287037037037 | 49.908 |
| 0.9268402777777779 | 49.908 |
| 0.9268518518518518 | 49.909 |
| 0.926863425925926 | 49.907 |
| 0.926875 | 49.904 |
| 0.926886574074074 | 49.902 |
| 0.9268981481481481 | 49.903 |
| 0.9269097222222222 | 49.905 |
| 0.9269212962962964 | 49.908 |
| 0.9269328703703703 | 49.91 |
| 0.9269444444444445 | 49.912 |
| 0.9269560185185185 | 49.915 |
| 0.9269675925925926 | 49.918 |
| 0.9269791666666666 | 49.92 |
| 0.9269907407407407 | 49.92 |
| 0.9270023148148149 | 49.92 |
| 0.9270138888888889 | 49.919 |
| 0.927025462962963 | 49.919 |
| 0.927037037037037 | 49.917 |
| 0.9270486111111111 | 49.916 |
| 0.9270601851851853 | 49.913 |
| 0.9270717592592592 | 49.911 |
| 0.9270833333333334 | 49.908 |
| 0.9270949074074074 | 49.906 |
| 0.9271064814814814 | 49.905 |
| 0.9271180555555555 | 49.901 |
| 0.9271296296296296 | 49.9 |
| 0.9271412037037038 | 49.899 |
| 0.9271527777777777 | 49.898 |
| 0.9271643518518519 | 49.897 |
| 0.9271759259259259 | 49.895 |
| 0.9271875 | 49.896 |
| 0.927199074074074 | 49.895 |
| 0.9272106481481481 | 49.895 |
| 0.9272222222222223 | 49.895 |
| 0.9272337962962963 | 49.895 |
| 0.9272453703703704 | 49.896 |
| 0.9272569444444444 | 49.894 |
| 0.9272685185185185 | 49.895 |
| 0.9272800925925927 | 49.896 |
| 0.9272916666666666 | 49.898 |
| 0.9273032407407408 | 49.899 |
| 0.9273148148148148 | 49.901 |
| 0.9273263888888889 | 49.901 |
| 0.9273379629629629 | 49.901 |
| 0.927349537037037 | 49.901 |
| 0.9273611111111112 | 49.898 |
| 0.9273726851851851 | 49.899 |
| 0.9273842592592593 | 49.897 |
| 0.9273958333333333 | 49.897 |
| 0.9274074074074075 | 49.898 |
| 0.9274189814814814 | 49.898 |
| 0.9274305555555555 | 49.898 |
| 0.9274421296296297 | 49.898 |
| 0.9274537037037037 | 49.897 |
| 0.9274652777777778 | 49.895 |
| 0.9274768518518518 | 49.894 |
| 0.927488425925926 | 49.894 |
| 0.9275000000000001 | 49.894 |
| 0.927511574074074 | 49.893 |
| 0.9275231481481482 | 49.893 |
| 0.9275347222222222 | 49.889 |
| 0.9275462962962964 | 49.885 |
| 0.9275578703703703 | 49.885 |
| 0.9275694444444444 | 49.885 |
| 0.9275810185185186 | 49.885 |
| 0.9275925925925925 | 49.888 |
| 0.9276041666666667 | 49.89 |
| 0.9276157407407407 | 49.892 |
| 0.9276273148148149 | 49.894 |
| 0.9276388888888888 | 49.898 |
| 0.9276504629629629 | 49.901 |
| 0.9276620370370371 | 49.904 |
| 0.9276736111111111 | 49.906 |
| 0.9276851851851852 | 49.908 |
| 0.9276967592592592 | 49.909 |
| 0.9277083333333334 | 49.906 |
| 0.9277199074074075 | 49.904 |
| 0.9277314814814814 | 49.902 |
| 0.9277430555555556 | 49.899 |
| 0.9277546296296296 | 49.898 |
| 0.9277662037037038 | 49.893 |
| 0.9277777777777777 | 49.889 |
| 0.9277893518518519 | 49.885 |
| 0.927800925925926 | 49.883 |
| 0.9278124999999999 | 49.882 |
| 0.9278240740740741 | 49.881 |
| 0.9278356481481481 | 49.884 |
| 0.9278472222222223 | 49.886 |
| 0.9278587962962962 | 49.889 |
| 0.9278703703703703 | 49.892 |
| 0.9278819444444445 | 49.893 |
| 0.9278935185185185 | 49.893 |
| 0.9279050925925926 | 49.895 |
| 0.9279166666666666 | 49.899 |
| 0.9279282407407408 | 49.902 |
| 0.9279398148148149 | 49.905 |
| 0.9279513888888888 | 49.906 |
| 0.927962962962963 | 49.905 |
| 0.927974537037037 | 49.902 |
| 0.9279861111111112 | 49.898 |
| 0.9279976851851851 | 49.897 |
| 0.9280092592592593 | 49.895 |
| 0.9280208333333334 | 49.895 |
| 0.9280324074074073 | 49.897 |
| 0.9280439814814815 | 49.901 |
| 0.9280555555555555 | 49.902 |
| 0.9280671296296297 | 49.903 |
| 0.9280787037037036 | 49.905 |
| 0.9280902777777778 | 49.904 |
| 0.9281018518518519 | 49.903 |
| 0.9281134259259259 | 49.902 |
| 0.928125 | 49.9 |
| 0.928136574074074 | 49.902 |
| 0.9281481481481482 | 49.902 |
| 0.9281597222222223 | 49.905 |
| 0.9281712962962962 | 49.904 |
| 0.9281828703703704 | 49.905 |
| 0.9281944444444444 | 49.904 |
| 0.9282060185185186 | 49.904 |
| 0.9282175925925925 | 49.905 |
| 0.9282291666666667 | 49.908 |
| 0.9282407407407408 | 49.909 |
| 0.9282523148148148 | 49.91 |
| 0.9282638888888889 | 49.913 |
| 0.9282754629629629 | 49.915 |
| 0.9282870370370371 | 49.917 |
| 0.928298611111111 | 49.918 |
| 0.9283101851851852 | 49.917 |
| 0.9283217592592593 | 49.918 |
| 0.9283333333333333 | 49.919 |
| 0.9283449074074074 | 49.92 |
| 0.9283564814814814 | 49.92 |
| 0.9283680555555556 | 49.918 |
| 0.9283796296296297 | 49.918 |
| 0.9283912037037036 | 49.917 |
| 0.9284027777777778 | 49.917 |
| 0.9284143518518518 | 49.915 |
| 0.928425925925926 | 49.914 |
| 0.9284374999999999 | 49.915 |
| 0.9284490740740741 | 49.915 |
| 0.9284606481481482 | 49.916 |
| 0.9284722222222223 | 49.916 |
| 0.9284837962962963 | 49.915 |
| 0.9284953703703703 | 49.916 |
| 0.9285069444444445 | 49.918 |
| 0.9285185185185184 | 49.918 |
| 0.9285300925925926 | 49.919 |
| 0.9285416666666667 | 49.92 |
| 0.9285532407407407 | 49.921 |
| 0.9285648148148148 | 49.92 |
| 0.9285763888888888 | 49.919 |
| 0.928587962962963 | 49.916 |
| 0.9285995370370371 | 49.917 |
| 0.928611111111111 | 49.915 |
| 0.9286226851851852 | 49.914 |
| 0.9286342592592592 | 49.914 |
| 0.9286458333333334 | 49.914 |
| 0.9286574074074073 | 49.915 |
| 0.9286689814814815 | 49.914 |
| 0.9286805555555556 | 49.912 |
| 0.9286921296296297 | 49.909 |
| 0.9287037037037037 | 49.905 |
| 0.9287152777777777 | 49.902 |
| 0.9287268518518519 | 49.898 |
| 0.928738425925926 | 49.898 |
| 0.92875 | 49.897 |
| 0.9287615740740741 | 49.895 |
| 0.9287731481481482 | 49.894 |
| 0.9287847222222222 | 49.892 |
| 0.9287962962962962 | 49.891 |
| 0.9288078703703704 | 49.889 |
| 0.9288194444444445 | 49.886 |
| 0.9288310185185185 | 49.886 |
| 0.9288425925925926 | 49.884 |
| 0.9288541666666666 | 49.885 |
| 0.9288657407407408 | 49.884 |
| 0.9288773148148147 | 49.883 |
| 0.9288888888888889 | 49.883 |
| 0.928900462962963 | 49.882 |
| 0.9289120370370371 | 49.882 |
| 0.9289236111111111 | 49.882 |
| 0.9289351851851851 | 49.883 |
| 0.9289467592592593 | 49.882 |
| 0.9289583333333334 | 49.881 |
| 0.9289699074074074 | 49.881 |
| 0.9289814814814815 | 49.882 |
| 0.9289930555555556 | 49.882 |
| 0.9290046296296296 | 49.884 |
| 0.9290162037037036 | 49.886 |
| 0.9290277777777778 | 49.891 |
| 0.9290393518518519 | 49.895 |
| 0.9290509259259259 | 49.895 |
| 0.9290625 | 49.899 |
| 0.929074074074074 | 49.899 |
| 0.9290856481481482 | 49.898 |
| 0.9290972222222221 | 49.9 |
| 0.9291087962962963 | 49.901 |
| 0.9291203703703704 | 49.901 |
| 0.9291319444444445 | 49.904 |
| 0.9291435185185185 | 49.903 |
| 0.9291550925925925 | 49.902 |
| 0.9291666666666667 | 49.903 |
| 0.9291782407407408 | 49.897 |
| 0.9291898148148148 | 49.893 |
| 0.9292013888888889 | 49.89 |
| 0.929212962962963 | 49.889 |
| 0.929224537037037 | 49.889 |
| 0.929236111111111 | 49.89 |
| 0.9292476851851852 | 49.893 |
| 0.9292592592592593 | 49.895 |
| 0.9292708333333333 | 49.899 |
| 0.9292824074074074 | 49.9 |
| 0.9292939814814815 | 49.899 |
| 0.9293055555555556 | 49.898 |
| 0.9293171296296295 | 49.896 |
| 0.9293287037037037 | 49.895 |
| 0.9293402777777778 | 49.893 |
| 0.9293518518518519 | 49.89 |
| 0.9293634259259259 | 49.887 |
| 0.929375 | 49.883 |
| 0.9293865740740741 | 49.881 |
| 0.9293981481481483 | 49.88 |
| 0.9294097222222222 | 49.879 |
| 0.9294212962962963 | 49.876 |
| 0.9294328703703704 | 49.878 |
| 0.9294444444444444 | 49.878 |
| 0.9294560185185184 | 49.88 |
| 0.9294675925925926 | 49.883 |
| 0.9294791666666667 | 49.883 |
| 0.9294907407407407 | 49.886 |
| 0.9295023148148148 | 49.887 |
| 0.9295138888888889 | 49.889 |
| 0.929525462962963 | 49.89 |
| 0.9295370370370369 | 49.89 |
| 0.9295486111111111 | 49.89 |
| 0.9295601851851852 | 49.889 |
| 0.9295717592592593 | 49.888 |
| 0.9295833333333333 | 49.888 |
| 0.9295949074074074 | 49.887 |
| 0.9296064814814815 | 49.885 |
| 0.9296180555555557 | 49.883 |
| 0.9296296296296296 | 49.882 |
| 0.9296412037037037 | 49.882 |
| 0.9296527777777778 | 49.882 |
| 0.9296643518518519 | 49.882 |
| 0.9296759259259259 | 49.883 |
| 0.9296875 | 49.885 |
| 0.9296990740740741 | 49.886 |
| 0.9297106481481481 | 49.885 |
| 0.9297222222222222 | 49.884 |
| 0.9297337962962963 | 49.884 |
| 0.9297453703703704 | 49.883 |
| 0.9297569444444443 | 49.888 |
| 0.9297685185185185 | 49.894 |
| 0.9297800925925926 | 49.9 |
| 0.9297916666666667 | 49.906 |
| 0.9298032407407407 | 49.912 |
| 0.9298148148148148 | 49.913 |
| 0.9298263888888889 | 49.915 |
| 0.9298379629629631 | 49.915 |
| 0.929849537037037 | 49.915 |
| 0.9298611111111111 | 49.913 |
| 0.9298726851851852 | 49.91 |
| 0.9298842592592593 | 49.906 |
| 0.9298958333333333 | 49.903 |
| 0.9299074074074074 | 49.901 |
| 0.9299189814814816 | 49.901 |
| 0.9299305555555556 | 49.903 |
| 0.9299421296296296 | 49.904 |
| 0.9299537037037037 | 49.907 |
| 0.9299652777777778 | 49.908 |
| 0.9299768518518517 | 49.908 |
| 0.9299884259259259 | 49.905 |
| 0.93 | 49.903 |
| 0.9300115740740741 | 49.902 |
| 0.9300231481481481 | 49.902 |
| 0.9300347222222222 | 49.902 |
| 0.9300462962962963 | 49.903 |
| 0.9300578703703705 | 49.904 |
| 0.9300694444444444 | 49.906 |
| 0.9300810185185185 | 49.906 |
| 0.9300925925925926 | 49.906 |
| 0.9301041666666667 | 49.907 |
| 0.9301157407407407 | 49.906 |
| 0.9301273148148148 | 49.907 |
| 0.930138888888889 | 49.909 |
| 0.930150462962963 | 49.909 |
| 0.930162037037037 | 49.91 |
| 0.9301736111111111 | 49.91 |
| 0.9301851851851852 | 49.913 |
| 0.9301967592592592 | 49.914 |
| 0.9302083333333333 | 49.915 |
| 0.9302199074074075 | 49.915 |
| 0.9302314814814815 | 49.915 |
| 0.9302430555555555 | 49.915 |
| 0.9302546296296296 | 49.914 |
| 0.9302662037037037 | 49.91 |
| 0.9302777777777779 | 49.906 |
| 0.9302893518518518 | 49.903 |
| 0.930300925925926 | 49.899 |
| 0.9303125 | 49.896 |
| 0.9303240740740741 | 49.895 |
| 0.9303356481481481 | 49.894 |
| 0.9303472222222222 | 49.896 |
| 0.9303587962962964 | 49.898 |
| 0.9303703703703704 | 49.902 |
| 0.9303819444444444 | 49.907 |
| 0.9303935185185185 | 49.91 |
| 0.9304050925925926 | 49.912 |
| 0.9304166666666666 | 49.913 |
| 0.9304282407407407 | 49.915 |
| 0.9304398148148149 | 49.917 |
| 0.9304513888888889 | 49.921 |
| 0.9304629629629629 | 49.923 |
| 0.930474537037037 | 49.921 |
| 0.9304861111111111 | 49.918 |
| 0.9304976851851853 | 49.919 |
| 0.9305092592592592 | 49.918 |
| 0.9305208333333334 | 49.917 |
| 0.9305324074074074 | 49.918 |
| 0.9305439814814815 | 49.919 |
| 0.9305555555555555 | 49.922 |
| 0.9305671296296296 | 49.922 |
| 0.9305787037037038 | 49.921 |
| 0.9305902777777778 | 49.92 |
| 0.9306018518518518 | 49.919 |
| 0.9306134259259259 | 49.922 |
| 0.930625 | 49.92 |
| 0.930636574074074 | 49.921 |
| 0.9306481481481481 | 49.919 |
| 0.9306597222222223 | 49.918 |
| 0.9306712962962963 | 49.92 |
| 0.9306828703703703 | 49.918 |
| 0.9306944444444444 | 49.918 |
| 0.9307060185185185 | 49.916 |
| 0.9307175925925927 | 49.914 |
| 0.9307291666666666 | 49.914 |
| 0.9307407407407408 | 49.916 |
| 0.9307523148148148 | 49.914 |
| 0.930763888888889 | 49.914 |
| 0.9307754629629629 | 49.914 |
| 0.930787037037037 | 49.913 |
| 0.9307986111111112 | 49.911 |
| 0.9308101851851852 | 49.912 |
| 0.9308217592592593 | 49.91 |
| 0.9308333333333333 | 49.913 |
| 0.9308449074074074 | 49.917 |
| 0.9308564814814816 | 49.922 |
| 0.9308680555555555 | 49.925 |
| 0.9308796296296297 | 49.928 |
| 0.9308912037037037 | 49.931 |
| 0.9309027777777777 | 49.934 |
| 0.9309143518518518 | 49.936 |
| 0.9309259259259259 | 49.938 |
| 0.9309375000000001 | 49.938 |
| 0.930949074074074 | 49.938 |
| 0.9309606481481482 | 49.936 |
| 0.9309722222222222 | 49.934 |
| 0.9309837962962964 | 49.932 |
| 0.9309953703703703 | 49.93 |
| 0.9310069444444444 | 49.929 |
| 0.9310185185185186 | 49.928 |
| 0.9310300925925926 | 49.929 |
| 0.9310416666666667 | 49.93 |
| 0.9310532407407407 | 49.932 |
| 0.9310648148148148 | 49.933 |
| 0.931076388888889 | 49.936 |
| 0.9310879629629629 | 49.938 |
| 0.9310995370370371 | 49.941 |
| 0.9311111111111111 | 49.944 |
| 0.9311226851851852 | 49.947 |
| 0.9311342592592592 | 49.951 |
| 0.9311458333333333 | 49.952 |
| 0.9311574074074075 | 49.953 |
| 0.9311689814814814 | 49.952 |
| 0.9311805555555556 | 49.951 |
| 0.9311921296296296 | 49.949 |
| 0.9312037037037038 | 49.949 |
| 0.9312152777777777 | 49.949 |
| 0.9312268518518518 | 49.948 |
| 0.931238425925926 | 49.949 |
| 0.93125 | 49.951 |
| 0.9312615740740741 | 49.951 |
| 0.9312731481481481 | 49.953 |
| 0.9312847222222222 | 49.955 |
| 0.9312962962962964 | 49.956 |
| 0.9313078703703703 | 49.958 |
| 0.9313194444444445 | 49.958 |
| 0.9313310185185185 | 49.958 |
| 0.9313425925925927 | 49.957 |
| 0.9313541666666666 | 49.957 |
| 0.9313657407407407 | 49.956 |
| 0.9313773148148149 | 49.956 |
| 0.9313888888888888 | 49.957 |
| 0.931400462962963 | 49.958 |
| 0.931412037037037 | 49.958 |
| 0.9314236111111112 | 49.956 |
| 0.9314351851851851 | 49.956 |
| 0.9314467592592592 | 49.956 |
| 0.9314583333333334 | 49.953 |
| 0.9314699074074074 | 49.95 |
| 0.9314814814814815 | 49.946 |
| 0.9314930555555555 | 49.944 |
| 0.9315046296296297 | 49.943 |
| 0.9315162037037038 | 49.941 |
| 0.9315277777777777 | 49.938 |
| 0.9315393518518519 | 49.934 |
| 0.9315509259259259 | 49.932 |
| 0.9315625000000001 | 49.931 |
| 0.931574074074074 | 49.93 |
| 0.9315856481481481 | 49.931 |
| 0.9315972222222223 | 49.934 |
| 0.9316087962962962 | 49.937 |
| 0.9316203703703704 | 49.939 |
| 0.9316319444444444 | 49.942 |
| 0.9316435185185186 | 49.943 |
| 0.9316550925925925 | 49.943 |
| 0.9316666666666666 | 49.942 |
| 0.9316782407407408 | 49.941 |
| 0.9316898148148148 | 49.938 |
| 0.9317013888888889 | 49.936 |
| 0.9317129629629629 | 49.935 |
| 0.9317245370370371 | 49.934 |
| 0.9317361111111112 | 49.935 |
| 0.9317476851851851 | 49.936 |
| 0.9317592592592593 | 49.938 |
| 0.9317708333333333 | 49.94 |
| 0.9317824074074075 | 49.944 |
| 0.9317939814814814 | 49.946 |
| 0.9318055555555556 | 49.949 |
| 0.9318171296296297 | 49.95 |
| 0.9318287037037036 | 49.951 |
| 0.9318402777777778 | 49.951 |
| 0.9318518518518518 | 49.948 |
| 0.931863425925926 | 49.943 |
| 0.9318749999999999 | 49.941 |
| 0.931886574074074 | 49.937 |
| 0.9318981481481482 | 49.933 |
| 0.9319097222222222 | 49.929 |
| 0.9319212962962963 | 49.925 |
| 0.9319328703703703 | 49.925 |
| 0.9319444444444445 | 49.924 |
| 0.9319560185185186 | 49.923 |
| 0.9319675925925925 | 49.923 |
| 0.9319791666666667 | 49.922 |
| 0.9319907407407407 | 49.921 |
| 0.9320023148148149 | 49.923 |
| 0.9320138888888888 | 49.927 |
| 0.932025462962963 | 49.932 |
| 0.9320370370370371 | 49.94 |
| 0.932048611111111 | 49.946 |
| 0.9320601851851852 | 49.95 |
| 0.9320717592592592 | 49.954 |
| 0.9320833333333334 | 49.954 |
| 0.9320949074074073 | 49.954 |
| 0.9321064814814815 | 49.954 |
| 0.9321180555555556 | 49.953 |
| 0.9321296296296296 | 49.952 |
| 0.9321412037037037 | 49.948 |
| 0.9321527777777777 | 49.944 |
| 0.9321643518518519 | 49.941 |
| 0.932175925925926 | 49.937 |
| 0.9321875 | 49.936 |
| 0.9321990740740741 | 49.934 |
| 0.9322106481481481 | 49.933 |
| 0.9322222222222223 | 49.934 |
| 0.9322337962962962 | 49.936 |
| 0.9322453703703704 | 49.938 |
| 0.9322569444444445 | 49.942 |
| 0.9322685185185186 | 49.945 |
| 0.9322800925925926 | 49.949 |
| 0.9322916666666666 | 49.951 |
| 0.9323032407407408 | 49.952 |
| 0.9323148148148147 | 49.953 |
| 0.9323263888888889 | 49.954 |
| 0.932337962962963 | 49.955 |
| 0.932349537037037 | 49.955 |
| 0.9323611111111111 | 49.956 |
| 0.9323726851851851 | 49.957 |
| 0.9323842592592593 | 49.962 |
| 0.9323958333333334 | 49.964 |
| 0.9324074074074074 | 49.969 |
| 0.9324189814814815 | 49.974 |
| 0.9324305555555555 | 49.976 |
| 0.9324421296296297 | 49.979 |
| 0.9324537037037036 | 49.977 |
| 0.9324652777777778 | 49.973 |
| 0.9324768518518519 | 49.971 |
| 0.932488425925926 | 49.971 |
| 0.9325 | 49.97 |
| 0.932511574074074 | 49.97 |
| 0.9325231481481482 | 49.968 |
| 0.9325347222222223 | 49.968 |
| 0.9325462962962963 | 49.967 |
| 0.9325578703703704 | 49.967 |
| 0.9325694444444445 | 49.966 |
| 0.9325810185185185 | 49.965 |
| 0.9325925925925925 | 49.965 |
| 0.9326041666666667 | 49.966 |
| 0.9326157407407408 | 49.966 |
| 0.9326273148148148 | 49.967 |
| 0.9326388888888889 | 49.969 |
| 0.932650462962963 | 49.971 |
| 0.9326620370370371 | 49.974 |
| 0.932673611111111 | 49.976 |
| 0.9326851851851852 | 49.98 |
| 0.9326967592592593 | 49.982 |
| 0.9327083333333334 | 49.984 |
| 0.9327199074074074 | 49.98 |
| 0.9327314814814814 | 49.977 |
| 0.9327430555555556 | 49.974 |
| 0.9327546296296297 | 49.971 |
| 0.9327662037037037 | 49.97 |
| 0.9327777777777778 | 49.971 |
| 0.9327893518518519 | 49.974 |
| 0.9328009259259259 | 49.98 |
| 0.9328124999999999 | 49.983 |
| 0.9328240740740741 | 49.988 |
| 0.9328356481481482 | 49.992 |
| 0.9328472222222222 | 49.994 |
| 0.9328587962962963 | 49.991 |
| 0.9328703703703703 | 49.99 |
| 0.9328819444444445 | 49.987 |
| 0.9328935185185184 | 49.985 |
| 0.9329050925925926 | 49.983 |
| 0.9329166666666667 | 49.982 |
| 0.9329282407407408 | 49.981 |
| 0.9329398148148148 | 49.981 |
| 0.9329513888888888 | 49.981 |
| 0.932962962962963 | 49.98 |
| 0.9329745370370371 | 49.978 |
| 0.9329861111111111 | 49.975 |
| 0.9329976851851852 | 49.973 |
| 0.9330092592592593 | 49.971 |
| 0.9330208333333333 | 49.971 |
| 0.9330324074074073 | 49.97 |
| 0.9330439814814815 | 49.969 |
| 0.9330555555555556 | 49.968 |
| 0.9330671296296296 | 49.968 |
| 0.9330787037037037 | 49.967 |
| 0.9330902777777778 | 49.968 |
| 0.9331018518518519 | 49.969 |
| 0.9331134259259258 | 49.97 |
| 0.933125 | 49.974 |
| 0.9331365740740741 | 49.977 |
| 0.9331481481481482 | 49.982 |
| 0.9331597222222222 | 49.985 |
| 0.9331712962962962 | 49.986 |
| 0.9331828703703704 | 49.988 |
| 0.9331944444444445 | 49.991 |
| 0.9332060185185185 | 49.992 |
| 0.9332175925925926 | 49.993 |
| 0.9332291666666667 | 49.991 |
| 0.9332407407407407 | 49.988 |
| 0.9332523148148147 | 49.984 |
| 0.9332638888888889 | 49.98 |
| 0.933275462962963 | 49.978 |
| 0.933287037037037 | 49.976 |
| 0.9332986111111111 | 49.978 |
| 0.9333101851851852 | 49.983 |
| 0.9333217592592593 | 49.986 |
| 0.9333333333333332 | 49.99 |
| 0.9333449074074074 | 49.991 |
| 0.9333564814814815 | 49.991 |
| 0.9333680555555556 | 49.991 |
| 0.9333796296296296 | 49.989 |
| 0.9333912037037037 | 49.989 |
| 0.9334027777777778 | 49.994 |
| 0.933414351851852 | 50.004 |
| 0.9334259259259259 | 50.01 |
| 0.9334375 | 50.013 |
| 0.9334490740740741 | 50.018 |
| 0.9334606481481482 | 50.019 |
| 0.9334722222222221 | 50.02 |
| 0.9334837962962963 | 50.019 |
| 0.9334953703703704 | 50.018 |
| 0.9335069444444444 | 50.015 |
| 0.9335185185185185 | 50.013 |
| 0.9335300925925926 | 50.013 |
| 0.9335416666666667 | 50.017 |
| 0.9335532407407406 | 50.021 |
| 0.9335648148148148 | 50.024 |
| 0.9335763888888889 | 50.026 |
| 0.933587962962963 | 50.027 |
| 0.933599537037037 | 50.027 |
| 0.9336111111111111 | 50.026 |
| 0.9336226851851852 | 50.027 |
| 0.9336342592592594 | 50.023 |
| 0.9336458333333333 | 50.021 |
| 0.9336574074074074 | 50.019 |
| 0.9336689814814815 | 50.017 |
| 0.9336805555555556 | 50.015 |
| 0.9336921296296296 | 50.011 |
| 0.9337037037037037 | 50.007 |
| 0.9337152777777779 | 50.005 |
| 0.9337268518518518 | 50.004 |
| 0.9337384259259259 | 50.003 |
| 0.93375 | 50.005 |
| 0.9337615740740741 | 50.008 |
| 0.933773148148148 | 50.011 |
| 0.9337847222222222 | 50.012 |
| 0.9337962962962963 | 50.012 |
| 0.9338078703703704 | 50.012 |
| 0.9338194444444444 | 50.013 |
| 0.9338310185185185 | 50.012 |
| 0.9338425925925926 | 50.015 |
| 0.9338541666666668 | 50.019 |
| 0.9338657407407407 | 50.021 |
| 0.9338773148148148 | 50.023 |
| 0.9338888888888889 | 50.025 |
| 0.933900462962963 | 50.025 |
| 0.933912037037037 | 50.026 |
| 0.9339236111111111 | 50.026 |
| 0.9339351851851853 | 50.027 |
| 0.9339467592592593 | 50.031 |
| 0.9339583333333333 | 50.032 |
| 0.9339699074074074 | 50.032 |
| 0.9339814814814815 | 50.033 |
| 0.9339930555555555 | 50.032 |
| 0.9340046296296296 | 50.03 |
| 0.9340162037037038 | 50.028 |